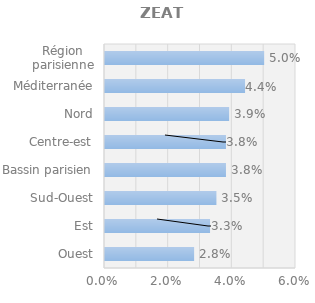
| Category | Series 0 |
|---|---|
| Ouest | 0.028 |
| Est | 0.033 |
| Sud-Ouest | 0.035 |
| Bassin parisien | 0.038 |
| Centre-est | 0.038 |
| Nord | 0.039 |
| Méditerranée | 0.044 |
| Région parisienne | 0.05 |